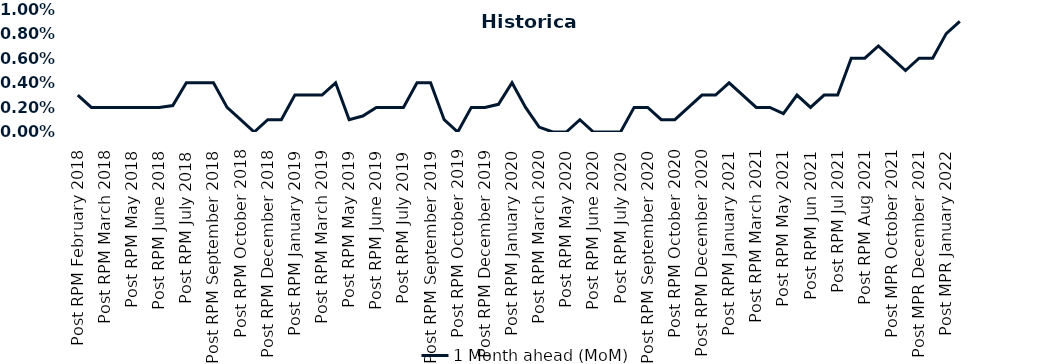
| Category | 1 Month ahead (MoM) |
|---|---|
| Post RPM February 2018 | 0.003 |
| Pre RPM March 2018 | 0.002 |
| Post RPM March 2018 | 0.002 |
| Pre RPM May 2018 | 0.002 |
| Post RPM May 2018 | 0.002 |
| Pre RPM June 2018 | 0.002 |
| Post RPM June 2018 | 0.002 |
| Pre RPM July 2018 | 0.002 |
| Post RPM July 2018 | 0.004 |
| Pre RPM September 2018 | 0.004 |
| Post RPM September 2018 | 0.004 |
| Pre RPM October 2018 | 0.002 |
| Post RPM October 2018 | 0.001 |
| Pre RPM December 2018 | 0 |
| Post RPM December 2018 | 0.001 |
| Pre RPM January 2019 | 0.001 |
| Post RPM January 2019 | 0.003 |
| Pre RPM March 2019 | 0.003 |
| Post RPM March 2019 | 0.003 |
| Pre RPM May 2019 | 0.004 |
| Post RPM May 2019 | 0.001 |
| Pre RPM June 2019 | 0.001 |
| Post RPM June 2019 | 0.002 |
| Pre RPM July 2019 | 0.002 |
| Post RPM July 2019 | 0.002 |
| Pre RPM September 2019 | 0.004 |
| Post RPM September 2019 | 0.004 |
| Pre RPM October 2019 | 0.001 |
| Post RPM October 2019 | 0 |
| Pre RPM December 2019 | 0.002 |
| Post RPM December 2019 | 0.002 |
| Pre RPM January 2020 | 0.002 |
| Post RPM January 2020 | 0.004 |
| Pre RPM March 2020 | 0.002 |
| Post RPM March 2020 | 0 |
| Pre RPM May 2020 | 0 |
| Post RPM May 2020 | 0 |
| Pre RPM June 2020 | 0.001 |
| Post RPM June 2020 | 0 |
| Pre RPM July 2020 | 0 |
| Post RPM July 2020 | 0 |
| Pre RPM September 2020 | 0.002 |
| Post RPM September 2020 | 0.002 |
| Pre RPM October 2020 | 0.001 |
| Post RPM October 2020 | 0.001 |
| Pre RPM December 2020 | 0.002 |
|  Post RPM December 2020 | 0.003 |
| Pre RPM January 2021 | 0.003 |
| Post RPM January 2021 | 0.004 |
|  Pre RPM March 2021 | 0.003 |
|  Post RPM March 2021 | 0.002 |
|  Pre RPM May 2021 | 0.002 |
|  Post RPM May 2021 | 0.002 |
|  Pre RPM Jun 2021 | 0.003 |
|   Post RPM Jun 2021 | 0.002 |
| Pre RPM Jul 2021 | 0.003 |
|  Post RPM Jul 2021 | 0.003 |
| Pre RPM Aug 2021 | 0.006 |
|  Post RPM Aug 2021 | 0.006 |
| Pre MPR October 2021 | 0.007 |
| Post MPR October 2021 | 0.006 |
| Pre MPR December 2021 | 0.005 |
| Post MPR December 2021 | 0.006 |
| Pre MPR January 2022 | 0.006 |
| Post MPR January 2022 | 0.008 |
| Pre MPR March 2022 | 0.009 |